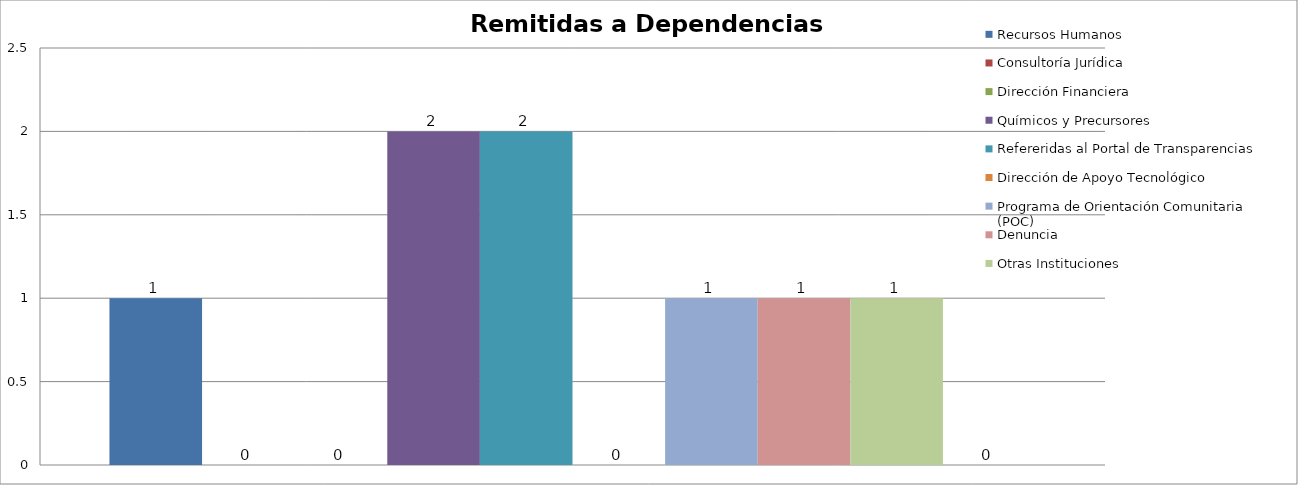
| Category | Recursos Humanos  | Consultoría Jurídica | Dirección Financiera | Químicos y Precursores | Refereridas al Portal de Transparencias | Dirección de Apoyo Tecnológico | Programa de Orientación Comunitaria (POC) | Denuncia | Otras Instituciones | Incompleta |
|---|---|---|---|---|---|---|---|---|---|---|
| 0 | 1 | 0 | 0 | 2 | 2 | 0 | 1 | 1 | 1 | 0 |